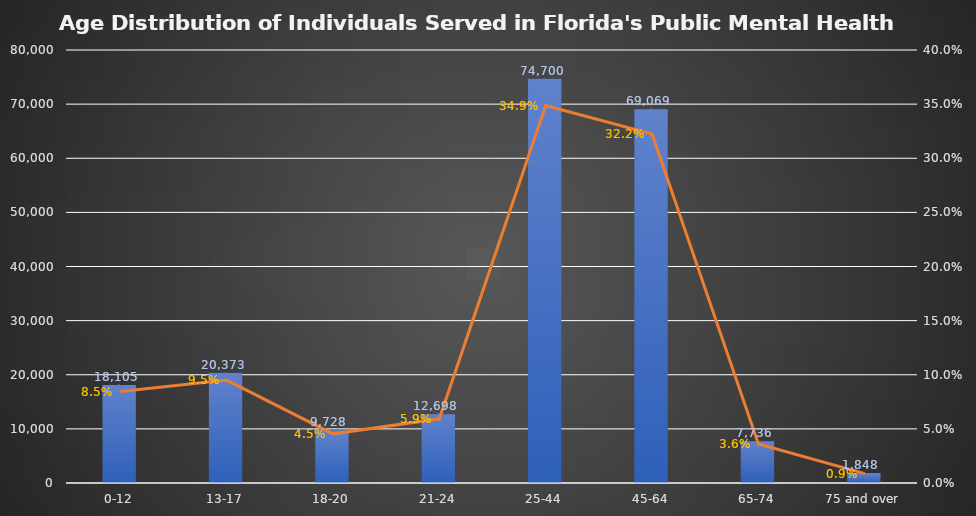
| Category | Series 0 |
|---|---|
| 0-12 | 18105 |
| 13-17 | 20373 |
| 18-20 | 9728 |
| 21-24 | 12698 |
| 25-44 | 74700 |
| 45-64 | 69069 |
| 65-74 | 7736 |
| 75 and over | 1848 |